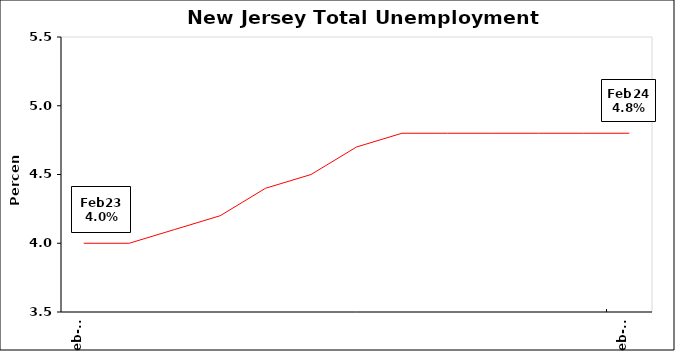
| Category | Unemp Rate |
|---|---|
| 2023-02-12 | 4 |
| 2023-03-12 | 4 |
| 2023-04-12 | 4.1 |
| 2023-05-12 | 4.2 |
| 2023-06-12 | 4.4 |
| 2023-07-12 | 4.5 |
| 2023-08-12 | 4.7 |
| 2023-09-12 | 4.8 |
| 2023-10-12 | 4.8 |
| 2023-11-12 | 4.8 |
| 2023-12-12 | 4.8 |
| 2024-01-12 | 4.8 |
| 2024-02-12 | 4.8 |